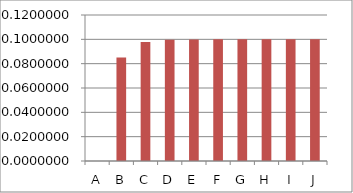
| Category | Series 0 |
|---|---|
| A | 0 |
| B | 0.085 |
| C | 0.098 |
| D | 0.1 |
| E | 0.1 |
| F | 0.1 |
| G | 0.1 |
| H | 0.1 |
| I | 0.1 |
| J | 0.1 |